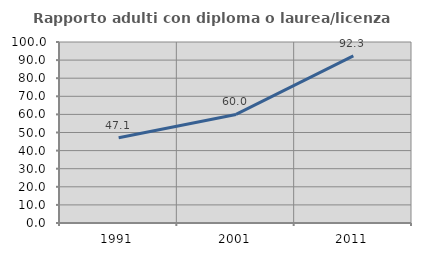
| Category | Rapporto adulti con diploma o laurea/licenza media  |
|---|---|
| 1991.0 | 47.091 |
| 2001.0 | 59.981 |
| 2011.0 | 92.29 |